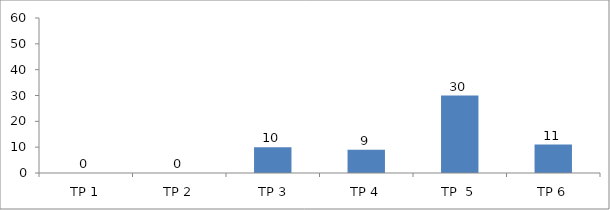
| Category | BIL. MURID |
|---|---|
| TP 1 | 0 |
| TP 2 | 0 |
|  TP 3 | 10 |
| TP 4 | 9 |
| TP  5 | 30 |
| TP 6 | 11 |